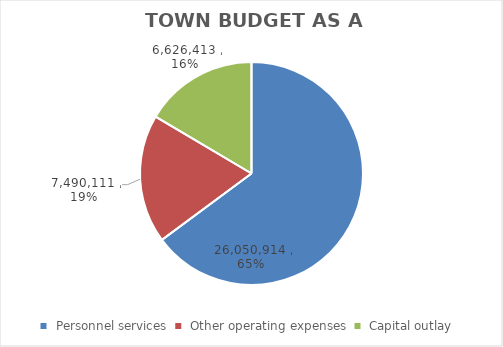
| Category | Series 0 | Series 1 | Series 2 | Series 3 | Series 4 | Series 5 | Series 6 |
|---|---|---|---|---|---|---|---|
| Personnel services | 26050914 |  |  | 23775371 | 25817334 | 26014444.897 | 26050914 |
| Other operating expenses | 7490110.65 |  |  | 6623047 | 6932207 | 7552955.65 | 7490110.65 |
| Capital outlay | 6626413 |  |  | 12381449 | 14831003 | 7201413 | 6626413 |